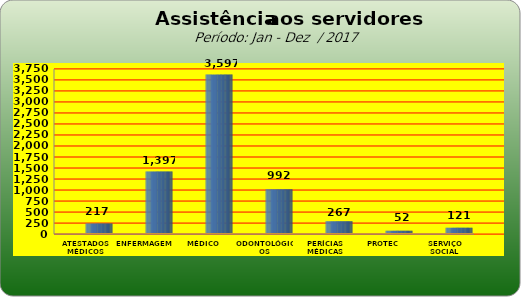
| Category | Series 0 |
|---|---|
| ATESTADOS MÉDICOS | 217 |
| ENFERMAGEM | 1397 |
| MÉDICO | 3597 |
| ODONTOLÓGICOS | 992 |
| PERÍCIAS MÉDICAS | 267 |
| PROTEC | 52 |
| SERVIÇO SOCIAL | 121 |